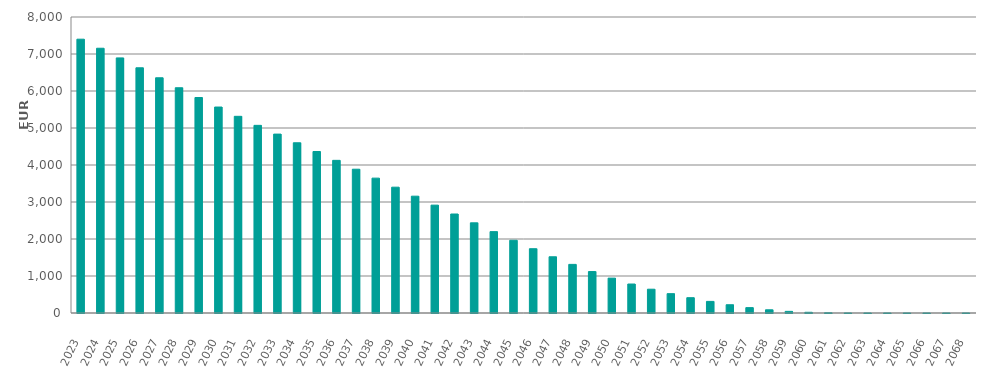
| Category | EUR Millions |
|---|---|
| 2023.0 | 7400000000.03 |
| 2024.0 | 7155796819.138 |
| 2025.0 | 6894695436.433 |
| 2026.0 | 6627460063.035 |
| 2027.0 | 6357603229.57 |
| 2028.0 | 6088119150.828 |
| 2029.0 | 5824222962.117 |
| 2030.0 | 5566590742.028 |
| 2031.0 | 5315688313.782 |
| 2032.0 | 5071763962.865 |
| 2033.0 | 4835263103.245 |
| 2034.0 | 4600872396.749 |
| 2035.0 | 4364535642.456 |
| 2036.0 | 4125517779.624 |
| 2037.0 | 3886214991.342 |
| 2038.0 | 3645213321 |
| 2039.0 | 3400668248.372 |
| 2040.0 | 3157230349.84 |
| 2041.0 | 2915129190.596 |
| 2042.0 | 2675626593.157 |
| 2043.0 | 2437000113.146 |
| 2044.0 | 2198945368.901 |
| 2045.0 | 1965132565.134 |
| 2046.0 | 1737466066.062 |
| 2047.0 | 1519587136.971 |
| 2048.0 | 1313822595.487 |
| 2049.0 | 1120257367.325 |
| 2050.0 | 942566754.255 |
| 2051.0 | 782962227.382 |
| 2052.0 | 642823817.217 |
| 2053.0 | 522450561.274 |
| 2054.0 | 413664331.128 |
| 2055.0 | 313565891.849 |
| 2056.0 | 223331479.235 |
| 2057.0 | 145268806.955 |
| 2058.0 | 86688714.097 |
| 2059.0 | 44168867.819 |
| 2060.0 | 19362426.291 |
| 2061.0 | 5889753.45 |
| 2062.0 | 775958.671 |
| 2063.0 | 72097.045 |
| 2064.0 | 40643.72 |
| 2065.0 | 23282.626 |
| 2066.0 | 13330.033 |
| 2067.0 | 7757.624 |
| 2068.0 | 1975.394 |